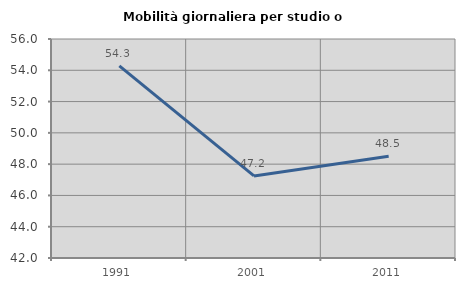
| Category | Mobilità giornaliera per studio o lavoro |
|---|---|
| 1991.0 | 54.282 |
| 2001.0 | 47.245 |
| 2011.0 | 48.498 |